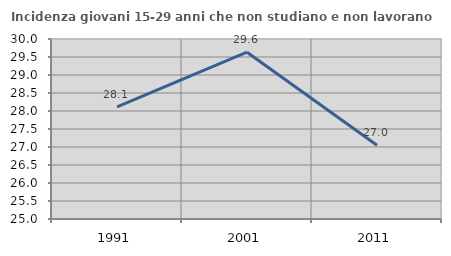
| Category | Incidenza giovani 15-29 anni che non studiano e non lavorano  |
|---|---|
| 1991.0 | 28.112 |
| 2001.0 | 29.633 |
| 2011.0 | 27.046 |